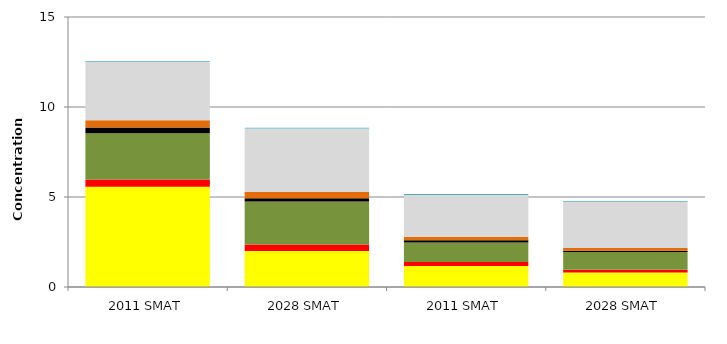
| Category | AMM_SO4 | AMM_NO3 | OM | EC | Soil | Coarse Mass | Sea Salt |
|---|---|---|---|---|---|---|---|
| 0 | 5.567 | 0.405 | 2.573 | 0.312 | 0.41 | 3.231 | 0.045 |
| 1 | 1.996 | 0.367 | 2.388 | 0.181 | 0.347 | 3.523 | 0.045 |
| 2 | 1.163 | 0.22 | 1.093 | 0.125 | 0.174 | 2.341 | 0.05 |
| 3 | 0.811 | 0.141 | 0.999 | 0.067 | 0.145 | 2.555 | 0.05 |